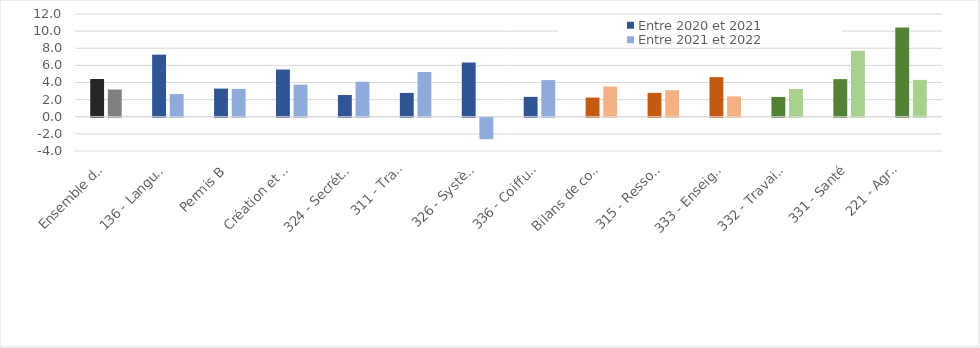
| Category | Entre 2020 et 2021 | Entre 2021 et 2022 |
|---|---|---|
| Ensemble des formations | 4.41 | 3.18 |
| 136 - Langues vivantes | 7.254 | 2.651 |
| Permis B | 3.286 | 3.25 |
| Création et reprise d'entreprise | 5.514 | 3.748 |
| 324 - Secrétariat, bureautique | 2.54 | 4.084 |
| 311 - Transport (hors permis B),
manutention, magasinage | 2.785 | 5.227 |
| 326 - Systèmes d'information | 6.334 | -2.504 |
| 336 - Coiffure, esthétique | 2.323 | 4.28 |
| Bilans de compétences | 2.236 | 3.535 |
| 315 - Ressources humaines | 2.791 | 3.103 |
| 333 - Enseignement, formation | 4.625 | 2.37 |
| 332 - Travail social | 2.316 | 3.231 |
| 331 - Santé | 4.395 | 7.701 |
| 221 - Agroalimentaire,
alimentation, cuisine | 10.425 | 4.303 |